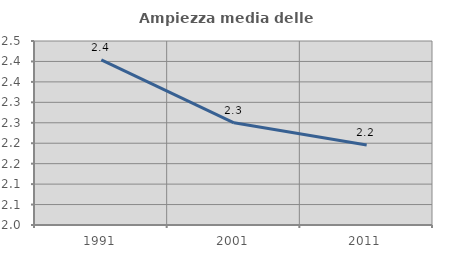
| Category | Ampiezza media delle famiglie |
|---|---|
| 1991.0 | 2.404 |
| 2001.0 | 2.25 |
| 2011.0 | 2.196 |